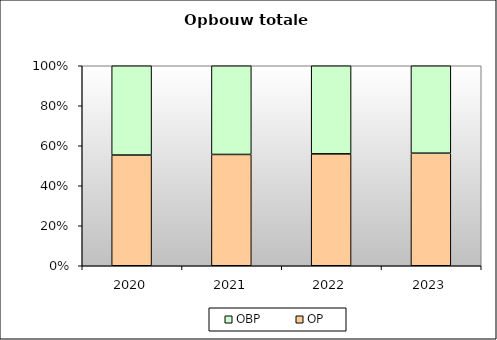
| Category | OP | OBP |
|---|---|---|
| 2020.0 | 73668.8 | 59437.867 |
| 2021.0 | 76558.4 | 61004.8 |
| 2022.0 | 79144 | 62302.4 |
| 2023.0 | 81822.4 | 63556.8 |